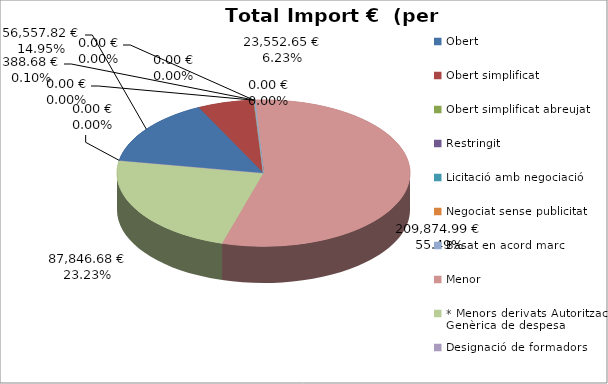
| Category | Total preu              (amb iva) |
|---|---|
| Obert | 56557.82 |
| Obert simplificat | 23552.65 |
| Obert simplificat abreujat | 0 |
| Restringit | 0 |
| Licitació amb negociació | 0 |
| Negociat sense publicitat | 0 |
| Basat en acord marc | 388.68 |
| Menor | 209874.99 |
| * Menors derivats Autorització Genèrica de despesa | 87846.68 |
| Designació de formadors | 0 |